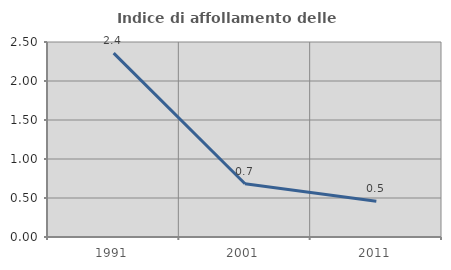
| Category | Indice di affollamento delle abitazioni  |
|---|---|
| 1991.0 | 2.358 |
| 2001.0 | 0.683 |
| 2011.0 | 0.459 |